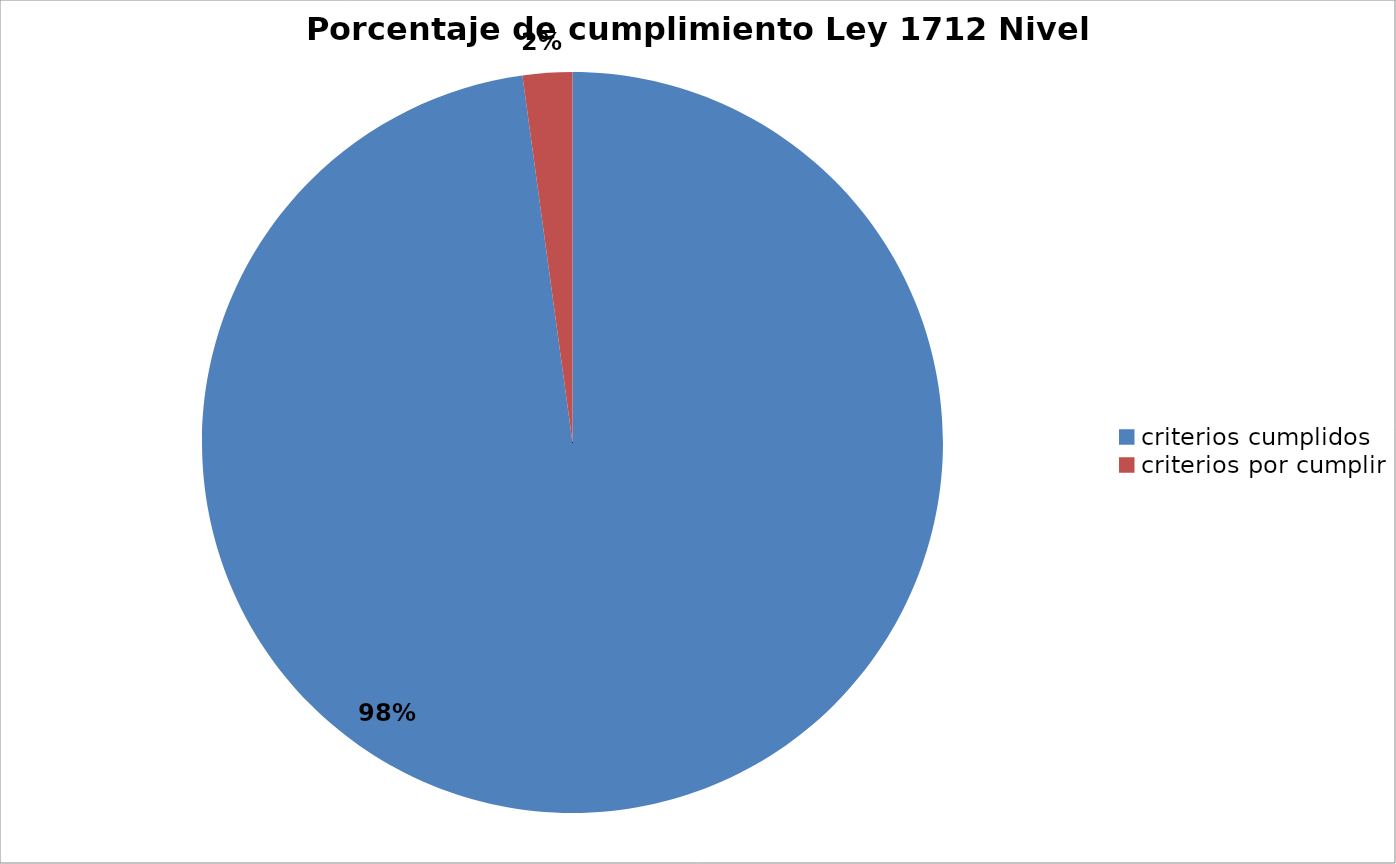
| Category | Series 0 |
|---|---|
| criterios cumplidos | 136 |
| criterios por cumplir | 3 |